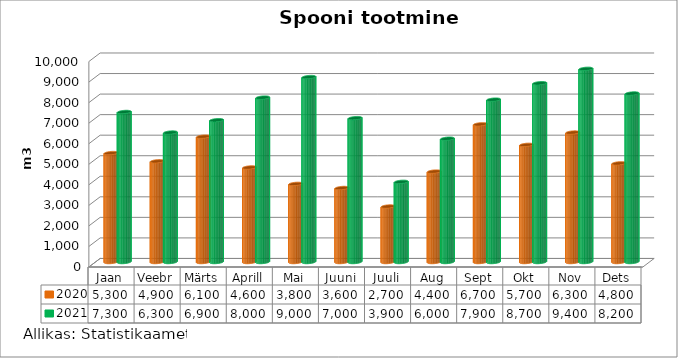
| Category | 2020 | 2021 |
|---|---|---|
| Jaan | 5300 | 7300 |
| Veebr | 4900 | 6300 |
| Märts | 6100 | 6900 |
| Aprill | 4600 | 8000 |
| Mai | 3800 | 9000 |
| Juuni | 3600 | 7000 |
| Juuli | 2700 | 3900 |
| Aug | 4400 | 6000 |
| Sept | 6700 | 7900 |
| Okt | 5700 | 8700 |
| Nov | 6300 | 9400 |
| Dets | 4800 | 8200 |